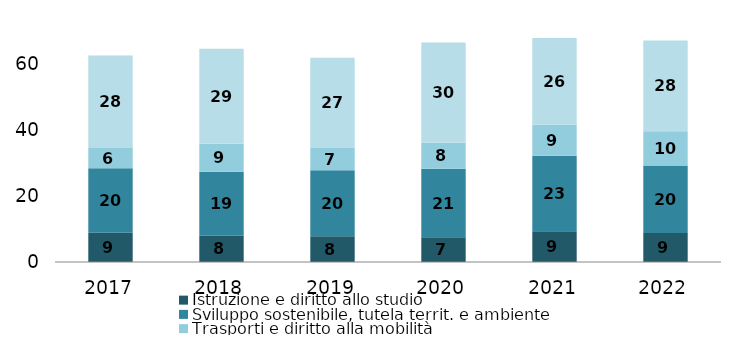
| Category | Istruzione e diritto allo studio | Sviluppo sostenibile, tutela territ. e ambiente | Trasporti e diritto alla mobilità | Diritti sociali, politiche sociali e famiglia |
|---|---|---|---|---|
| 2017.0 | 8.849 | 19.508 | 6.121 | 27.957 |
| 2018.0 | 7.955 | 19.305 | 8.543 | 28.692 |
| 2019.0 | 7.787 | 19.935 | 6.784 | 27.284 |
| 2020.0 | 7.453 | 20.733 | 7.865 | 30.326 |
| 2021.0 | 9.306 | 22.834 | 9.432 | 26.139 |
| 2022.0 | 8.776 | 20.424 | 10.313 | 27.505 |